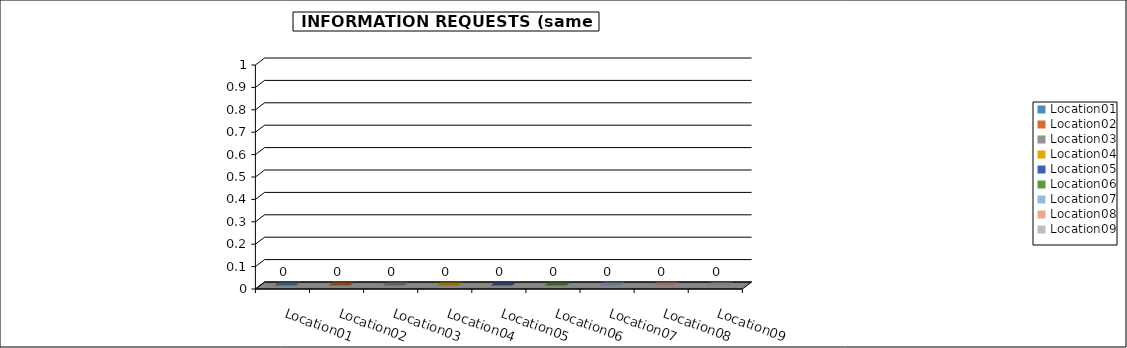
| Category | Data A |
|---|---|
| Location01 | 0 |
| Location02 | 0 |
| Location03 | 0 |
| Location04 | 0 |
| Location05 | 0 |
| Location06 | 0 |
| Location07 | 0 |
| Location08 | 0 |
| Location09 | 0 |